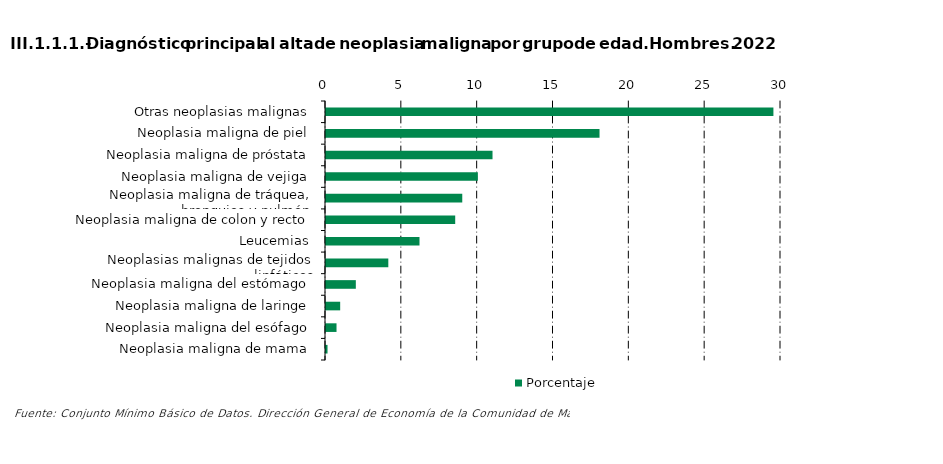
| Category | Porcentaje |
|---|---|
| Otras neoplasias malignas | 29.5 |
| Neoplasia maligna de piel | 18.035 |
| Neoplasia maligna de próstata | 10.979 |
| Neoplasia maligna de vejiga | 10.013 |
| Neoplasia maligna de tráquea, bronquios y pulmón | 8.984 |
| Neoplasia maligna de colon y recto | 8.519 |
| Leucemias | 6.164 |
| Neoplasias malignas de tejidos linfáticos | 4.109 |
| Neoplasia maligna del estómago | 1.967 |
| Neoplasia maligna de laringe | 0.935 |
| Neoplasia maligna del esófago | 0.694 |
| Neoplasia maligna de mama | 0.1 |